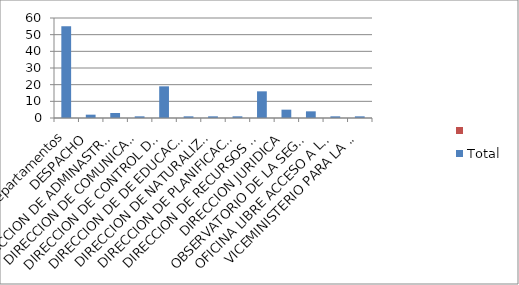
| Category | Total | Series 1 |
|---|---|---|
| Departamentos | 55 |  |
| DESPACHO | 2 |  |
| DIRECCION DE ADMINASTRATIVA Y FINANCIERA | 3 |  |
| DIRECCION DE COMUNICACIONES | 1 |  |
| DIRECCION DE CONTROL DE ARMAS | 19 |  |
| DIRECCION DE DE EDUCACION EN SEG. CIUDADANA | 1 |  |
| DIRECCION DE NATURALIZACION Y MIGRACION | 1 |  |
| DIRECCION DE PLANIFICACION Y DESARROLLO | 1 |  |
| DIRECCION DE RECURSOS HUMANOS | 16 |  |
| DIRECCION JURIDICA | 5 |  |
| OBSERVATORIO DE LA SEGURIDAD CIUDADANA | 4 |  |
| OFICINA LIBRE ACCESO A LA INFORMACION PUBLICA (OAI) | 1 |  |
| VICEMINISTERIO PARA LA SEGURIDAD DE INTERIOR | 1 |  |